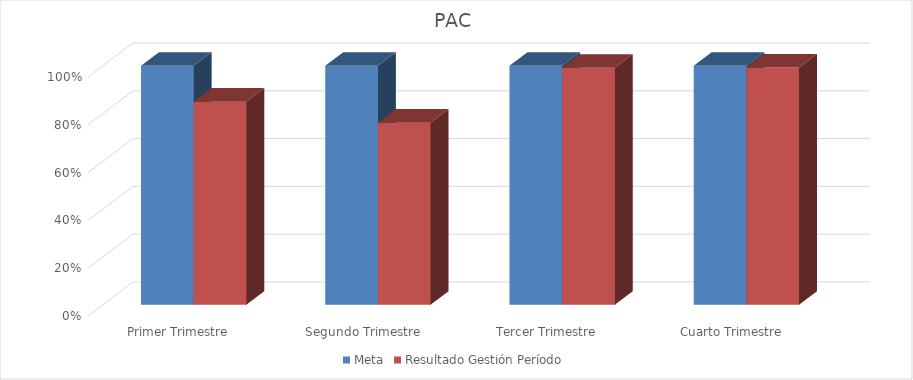
| Category | Meta | Resultado Gestión Período |
|---|---|---|
| Primer Trimestre | 1 | 0.85 |
| Segundo Trimestre | 1 | 0.762 |
| Tercer Trimestre | 1 | 0.992 |
| Cuarto Trimestre | 1 | 0.993 |